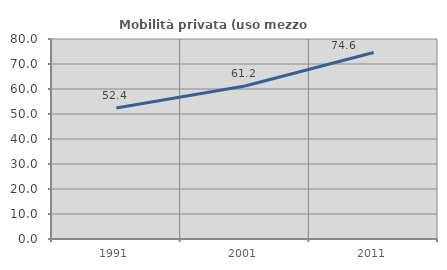
| Category | Mobilità privata (uso mezzo privato) |
|---|---|
| 1991.0 | 52.414 |
| 2001.0 | 61.202 |
| 2011.0 | 74.619 |